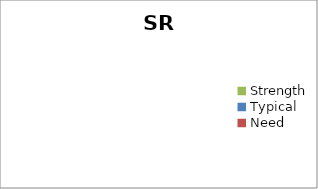
| Category | Series 0 |
|---|---|
| Strength | 0 |
| Typical | 0 |
| Need | 0 |